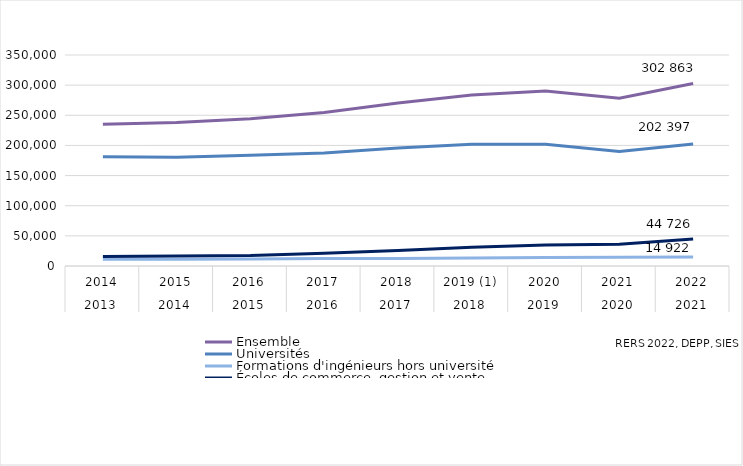
| Category | Ensemble | Universités | Formations d'ingénieurs hors université  | Écoles de commerce, gestion et vente |
|---|---|---|---|---|
| 0 | 235149 | 181040 | 11080 | 15661 |
| 1 | 238179 | 180506 | 11207 | 16423 |
| 2 | 244078 | 183869 | 11592 | 17476 |
| 3 | 254738 | 187642 | 12634 | 21276 |
| 4 | 270463 | 195600 | 12371 | 25860 |
| 5 | 283714 | 202151 | 13379 | 30907 |
| 6 | 290470 | 202140 | 14226 | 34653 |
| 7 | 278278 | 189935 | 14588 | 36125 |
| 8 | 302863 | 202397 | 14922 | 44726 |